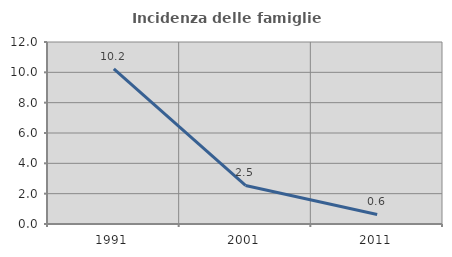
| Category | Incidenza delle famiglie numerose |
|---|---|
| 1991.0 | 10.232 |
| 2001.0 | 2.539 |
| 2011.0 | 0.627 |